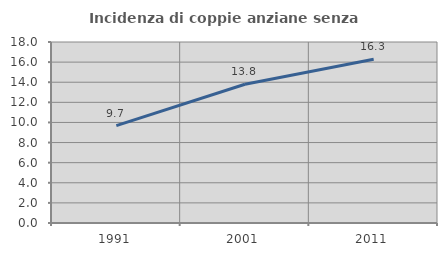
| Category | Incidenza di coppie anziane senza figli  |
|---|---|
| 1991.0 | 9.686 |
| 2001.0 | 13.793 |
| 2011.0 | 16.285 |